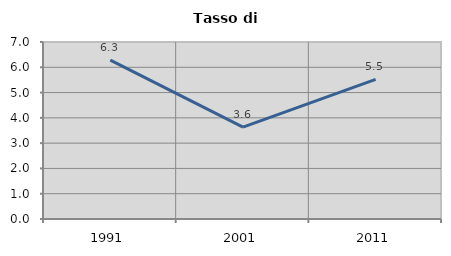
| Category | Tasso di disoccupazione   |
|---|---|
| 1991.0 | 6.281 |
| 2001.0 | 3.63 |
| 2011.0 | 5.519 |